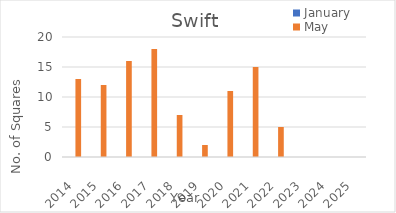
| Category | January | May |
|---|---|---|
| 2014.0 | 0 | 13 |
| 2015.0 | 0 | 12 |
| 2016.0 | 0 | 16 |
| 2017.0 | 0 | 18 |
| 2018.0 | 0 | 7 |
| 2019.0 | 0 | 2 |
| 2020.0 | 0 | 11 |
| 2021.0 | 0 | 15 |
| 2022.0 | 0 | 5 |
| 2023.0 | 0 | 0 |
| 2024.0 | 0 | 0 |
| 2025.0 | 0 | 0 |